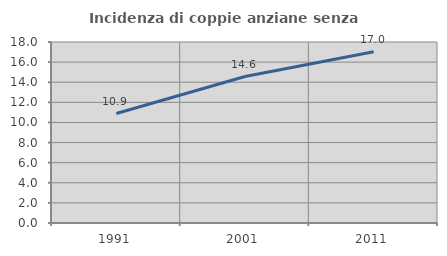
| Category | Incidenza di coppie anziane senza figli  |
|---|---|
| 1991.0 | 10.888 |
| 2001.0 | 14.568 |
| 2011.0 | 17.035 |